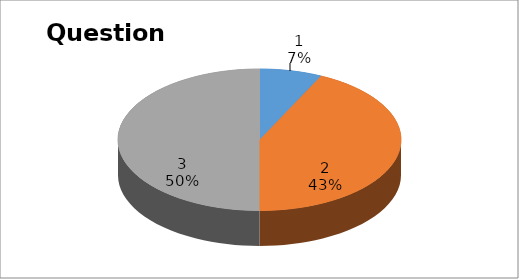
| Category | Series 0 |
|---|---|
| 0 | 3 |
| 1 | 18 |
| 2 | 21 |